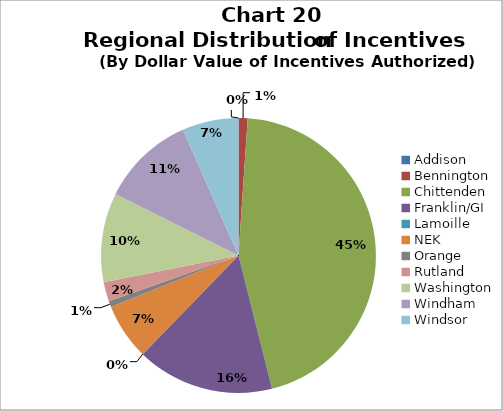
| Category | Series 0 | Series 1 |
|---|---|---|
| Addison | 0 | 0 |
| Bennington | 0.011 | 409113 |
| Chittenden | 0.45 | 17214958 |
| Franklin/GI | 0.162 | 6191346 |
| Lamoille | 0 | 0 |
| NEK | 0.066 | 2531988 |
| Orange | 0.007 | 267762 |
| Rutland | 0.023 | 882947 |
| Washington | 0.105 | 4013791 |
| Windham | 0.11 | 4195905 |
| Windsor | 0.066 | 2538456 |